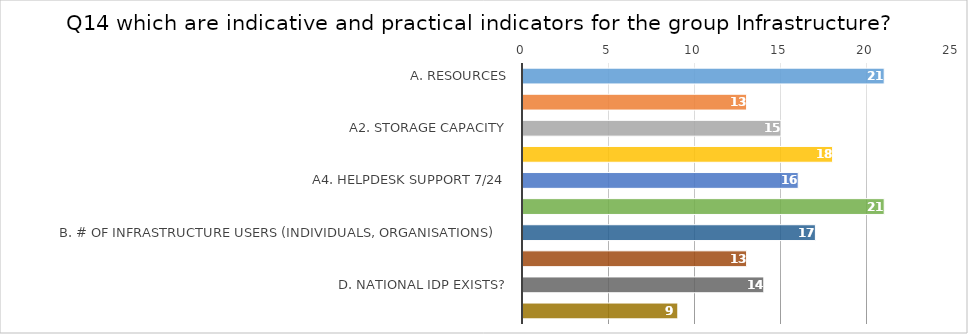
| Category | Series 0 |
|---|---|
| A. Resources | 21 |
| a1. # of CPUs | 13 |
| a2. Storage capacity | 15 |
| a3. Infrastructure Availability 7/24 | 18 |
| a4. Helpdesk support 7/24 | 16 |
| a5. Availability of certain types of infrastructure services to researchers (HPC, storage, HTC, GPUs, remote access to science facilities...) | 21 |
| B. # of infrastructure users (individuals, organisations)  | 17 |
| C. National NREN delegates security and user management policies? | 13 |
| D. National IdP exists? | 14 |
| E. TRLs | 9 |